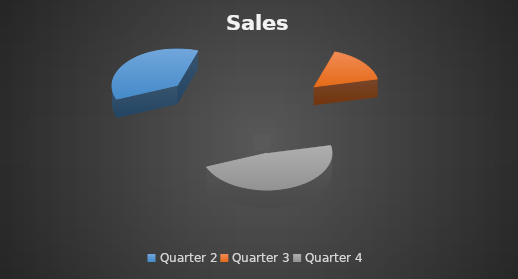
| Category | Sales |
|---|---|
| Quarter 2 | 760000 |
| Quarter 3 | 344000 |
| Quarter 4 | 992000 |